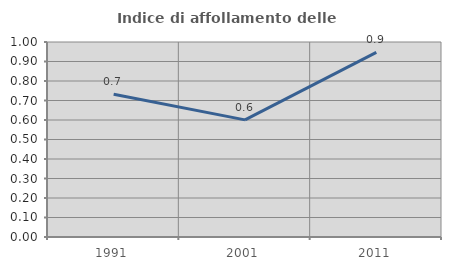
| Category | Indice di affollamento delle abitazioni  |
|---|---|
| 1991.0 | 0.732 |
| 2001.0 | 0.601 |
| 2011.0 | 0.946 |